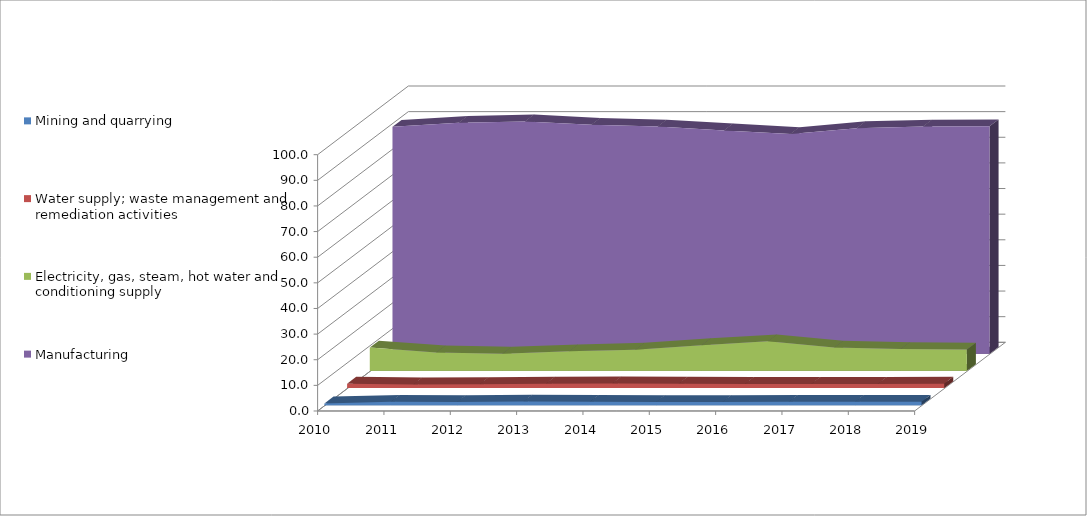
| Category | Mining and quarrying | Water supply; waste management and remediation activities | Electricity, gas, steam, hot water and conditioning supply | Manufacturing |
|---|---|---|---|---|
| 0 | 0.7 | 1.7 | 9.1 | 88.5 |
| 1 | 1.3 | 1.4 | 7.2 | 90.1 |
| 2 | 1.2 | 1.5 | 6.7 | 90.6 |
| 3 | 1.4 | 1.7 | 7.6 | 89.3 |
| 4 | 1.33 | 1.8 | 8.28 | 88.6 |
| 5 | 1.2 | 1.7 | 10 | 87.1 |
| 6 | 1.2 | 1.6 | 11.5 | 85.7 |
| 7 | 1.3 | 1.6 | 9.1 | 88 |
| 8 | 1.3 | 1.6 | 8.5 | 88.6 |
| 9 | 1.3 | 1.7 | 8.3 | 88.7 |